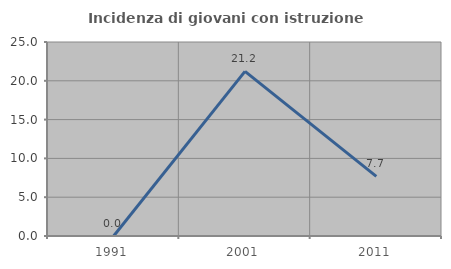
| Category | Incidenza di giovani con istruzione universitaria |
|---|---|
| 1991.0 | 0 |
| 2001.0 | 21.212 |
| 2011.0 | 7.692 |